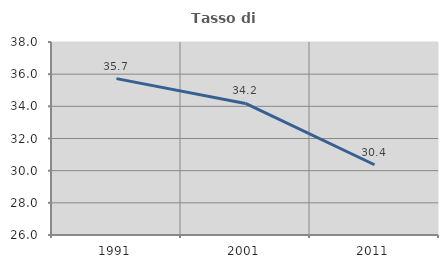
| Category | Tasso di occupazione   |
|---|---|
| 1991.0 | 35.721 |
| 2001.0 | 34.179 |
| 2011.0 | 30.369 |